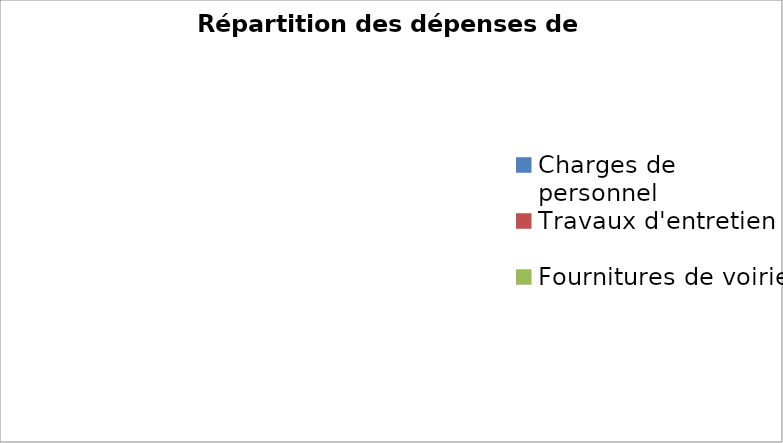
| Category | Series 0 |
|---|---|
| Charges de personnel | 0 |
| Travaux d'entretien  | 0 |
| Fournitures de voirie | 0 |